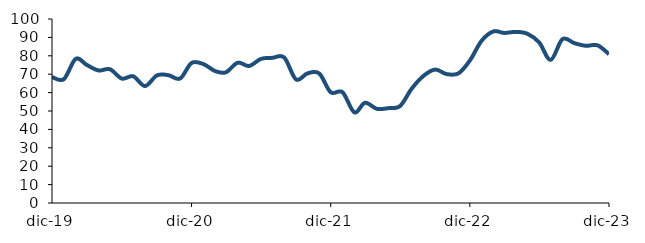
| Category | Series 0 |
|---|---|
| 2019-12-01 | 68.463 |
| 2020-01-01 | 67.272 |
| 2020-02-01 | 78.312 |
| 2020-03-01 | 75.068 |
| 2020-04-01 | 72.017 |
| 2020-05-01 | 72.705 |
| 2020-06-01 | 67.626 |
| 2020-07-01 | 68.877 |
| 2020-08-01 | 63.558 |
| 2020-09-01 | 69.323 |
| 2020-10-01 | 69.489 |
| 2020-11-01 | 67.65 |
| 2020-12-01 | 76.09 |
| 2021-01-01 | 75.497 |
| 2021-02-01 | 71.694 |
| 2021-03-01 | 71.025 |
| 2021-04-01 | 76.23 |
| 2021-05-01 | 74.474 |
| 2021-06-01 | 78.315 |
| 2021-07-01 | 78.891 |
| 2021-08-01 | 79.094 |
| 2021-09-01 | 67.17 |
| 2021-10-01 | 70.437 |
| 2021-11-01 | 70.41 |
| 2021-12-01 | 60.199 |
| 2022-01-01 | 60.205 |
| 2022-02-01 | 49.281 |
| 2022-03-01 | 54.449 |
| 2022-04-01 | 51.197 |
| 2022-05-01 | 51.538 |
| 2022-06-01 | 52.702 |
| 2022-07-01 | 62.012 |
| 2022-08-01 | 69.008 |
| 2022-09-01 | 72.516 |
| 2022-10-01 | 70.073 |
| 2022-11-01 | 70.447 |
| 2022-12-01 | 77.41 |
| 2023-01-01 | 88.21 |
| 2023-02-01 | 93.261 |
| 2023-03-01 | 92.425 |
| 2023-04-01 | 93.003 |
| 2023-05-01 | 91.972 |
| 2023-06-01 | 87.236 |
| 2023-07-01 | 77.784 |
| 2023-08-01 | 89.059 |
| 2023-09-01 | 86.888 |
| 2023-10-01 | 85.438 |
| 2023-11-01 | 85.696 |
| 2023-12-01 | 80.875 |